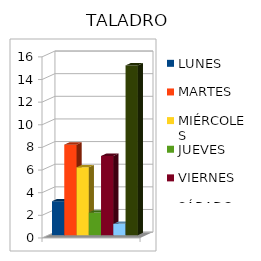
| Category | LUNES | MARTES | MIÉRCOLES | JUEVES | VIERNES | SÁBADO | DOMINGO |
|---|---|---|---|---|---|---|---|
|  | 3 | 8 | 6 | 2 | 7 | 1 | 15 |